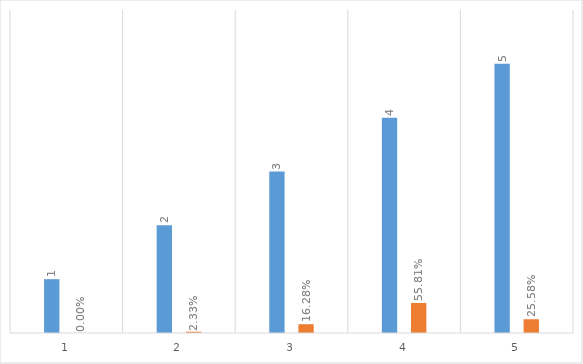
| Category | Series 0 | Series 1 |
|---|---|---|
| 0 | 1 | 0 |
| 1 | 2 | 0.023 |
| 2 | 3 | 0.163 |
| 3 | 4 | 0.558 |
| 4 | 5 | 0.256 |